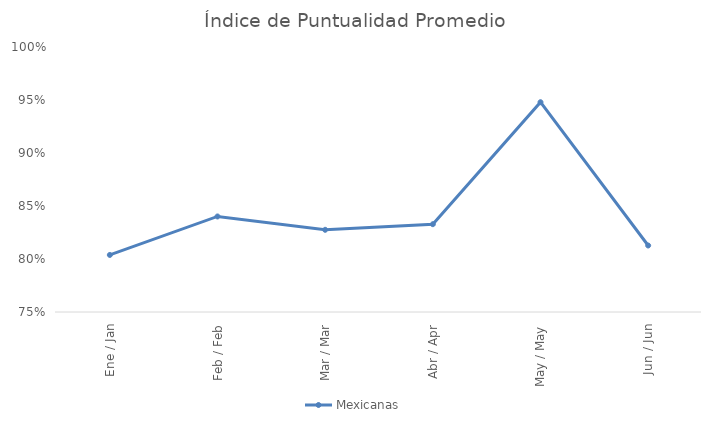
| Category | Mexicanas |
|---|---|
| Ene / Jan | 0.804 |
| Feb / Feb | 0.84 |
| Mar / Mar | 0.828 |
| Abr / Apr | 0.833 |
| May / May | 0.948 |
| Jun / Jun | 0.813 |